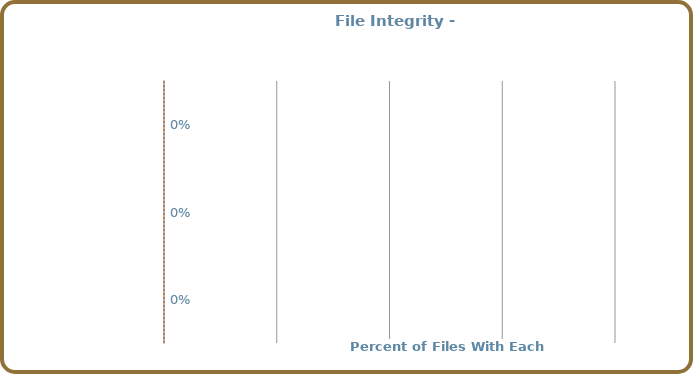
| Category | Organization |
|---|---|
|  | 0 |
|  | 0 |
|  | 0 |